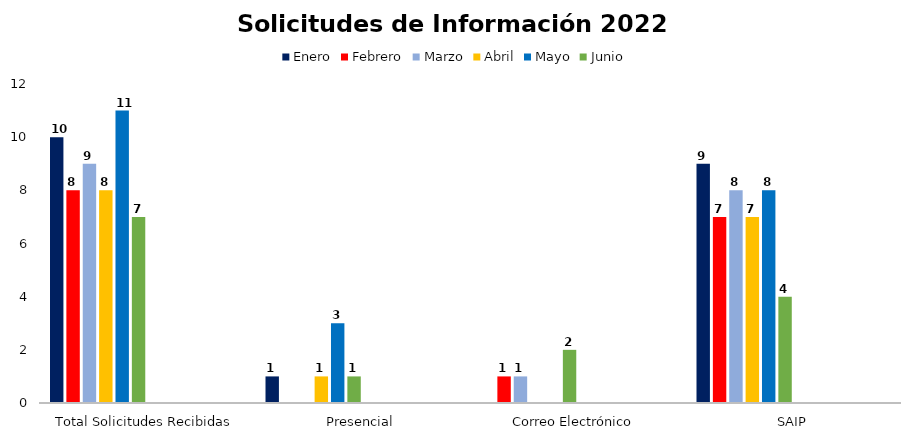
| Category | Enero | Febrero | Marzo | Abril | Mayo | Junio | Julio | Agosto | Septiembre | Octubre | Noviembre | Diciembre |
|---|---|---|---|---|---|---|---|---|---|---|---|---|
| Total Solicitudes Recibidas | 10 | 8 | 9 | 8 | 11 | 7 | 0 | 0 | 0 | 0 | 0 | 0 |
| Presencial | 1 | 0 | 0 | 1 | 3 | 1 | 0 | 0 | 0 | 0 | 0 | 0 |
| Correo Electrónico  | 0 | 1 | 1 | 0 | 0 | 2 | 0 | 0 | 0 | 0 | 0 | 0 |
| SAIP | 9 | 7 | 8 | 7 | 8 | 4 | 0 | 0 | 0 | 0 | 0 | 0 |